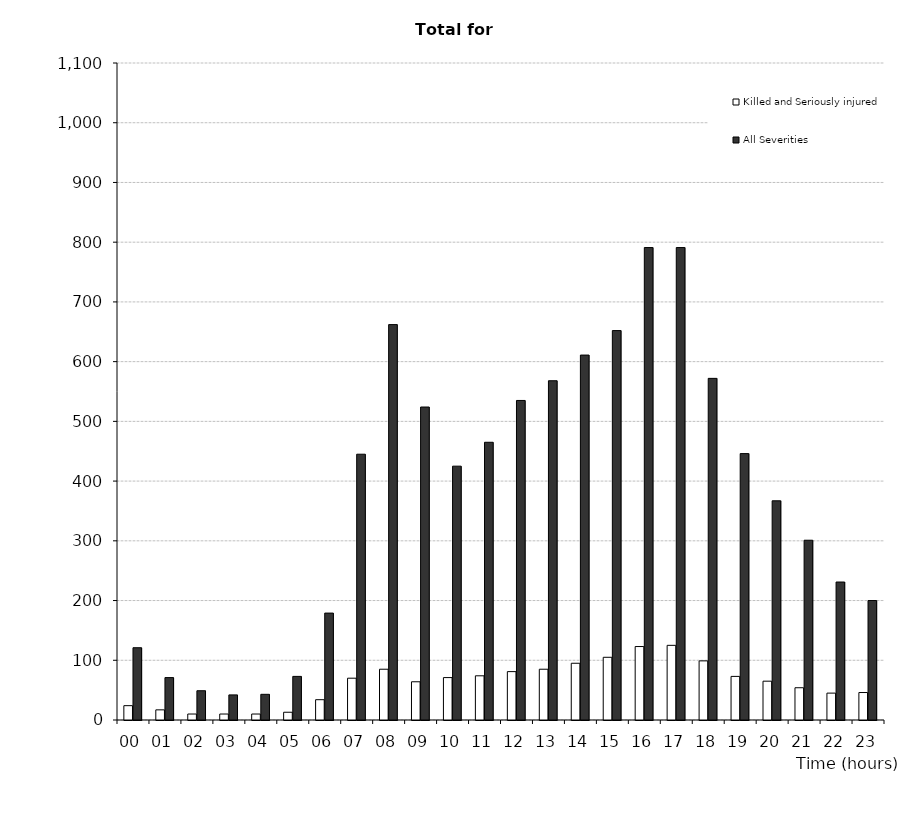
| Category | Killed and Seriously injured | All Severities |
|---|---|---|
| 00 | 24 | 121 |
| 01 | 17 | 71 |
| 02 | 10 | 49 |
| 03 | 10 | 42 |
| 04 | 10 | 43 |
| 05 | 13 | 73 |
| 06 | 34 | 179 |
| 07 | 70 | 445 |
| 08 | 85 | 662 |
| 09 | 64 | 524 |
| 10 | 71 | 425 |
| 11 | 74 | 465 |
| 12 | 81 | 535 |
| 13 | 85 | 568 |
| 14 | 95 | 611 |
| 15 | 105 | 652 |
| 16 | 123 | 791 |
| 17 | 125 | 791 |
| 18 | 99 | 572 |
| 19 | 73 | 446 |
| 20 | 65 | 367 |
| 21 | 54 | 301 |
| 22 | 45 | 231 |
| 23 | 46 | 200 |